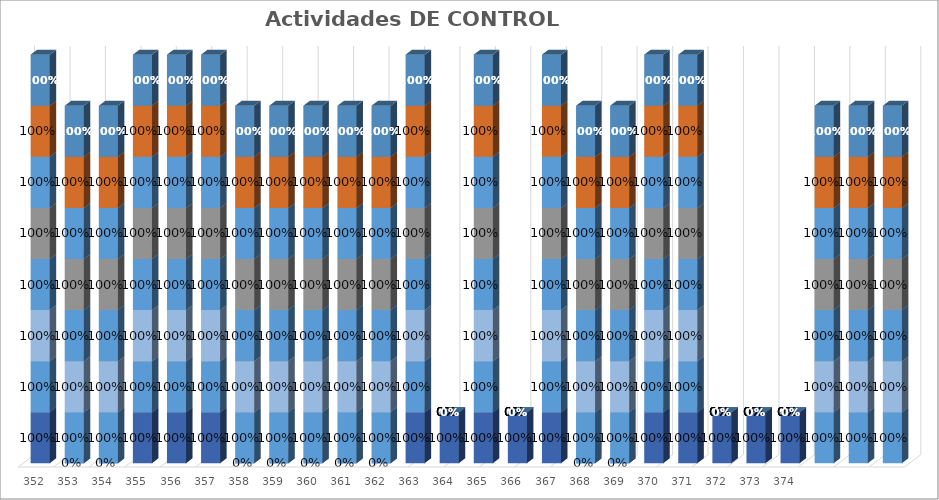
| Category | % Avance |
|---|---|
| 352.0 | 1 |
| 353.0 | 1 |
| 354.0 | 1 |
| 355.0 | 1 |
| 356.0 | 1 |
| 357.0 | 1 |
| 358.0 | 1 |
| 359.0 | 1 |
| 360.0 | 1 |
| 361.0 | 1 |
| 362.0 | 1 |
| 363.0 | 1 |
| 364.0 | 0 |
| 365.0 | 1 |
| 366.0 | 0 |
| 367.0 | 1 |
| 368.0 | 1 |
| 369.0 | 1 |
| 370.0 | 1 |
| 371.0 | 1 |
| 372.0 | 0 |
| 373.0 | 0 |
| 374.0 | 0 |